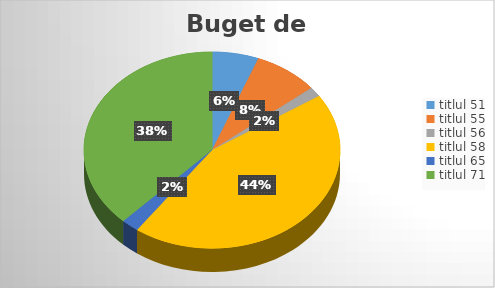
| Category | Series 0 |
|---|---|
| titlul 51 | 1590964 |
| titlul 55 | 2220972 |
| titlul 56 | 440000 |
| titlul 58 | 11960826 |
| titlul 65 | 600981 |
| titlul 71 | 10236657 |